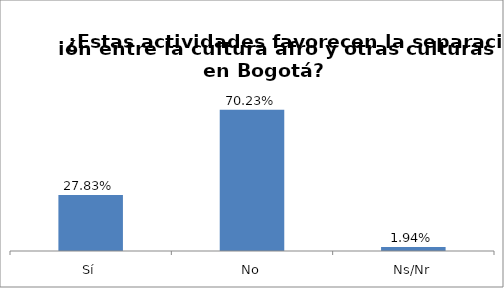
| Category | Total |
|---|---|
| Sí | 0.278 |
| No | 0.702 |
| Ns/Nr | 0.019 |